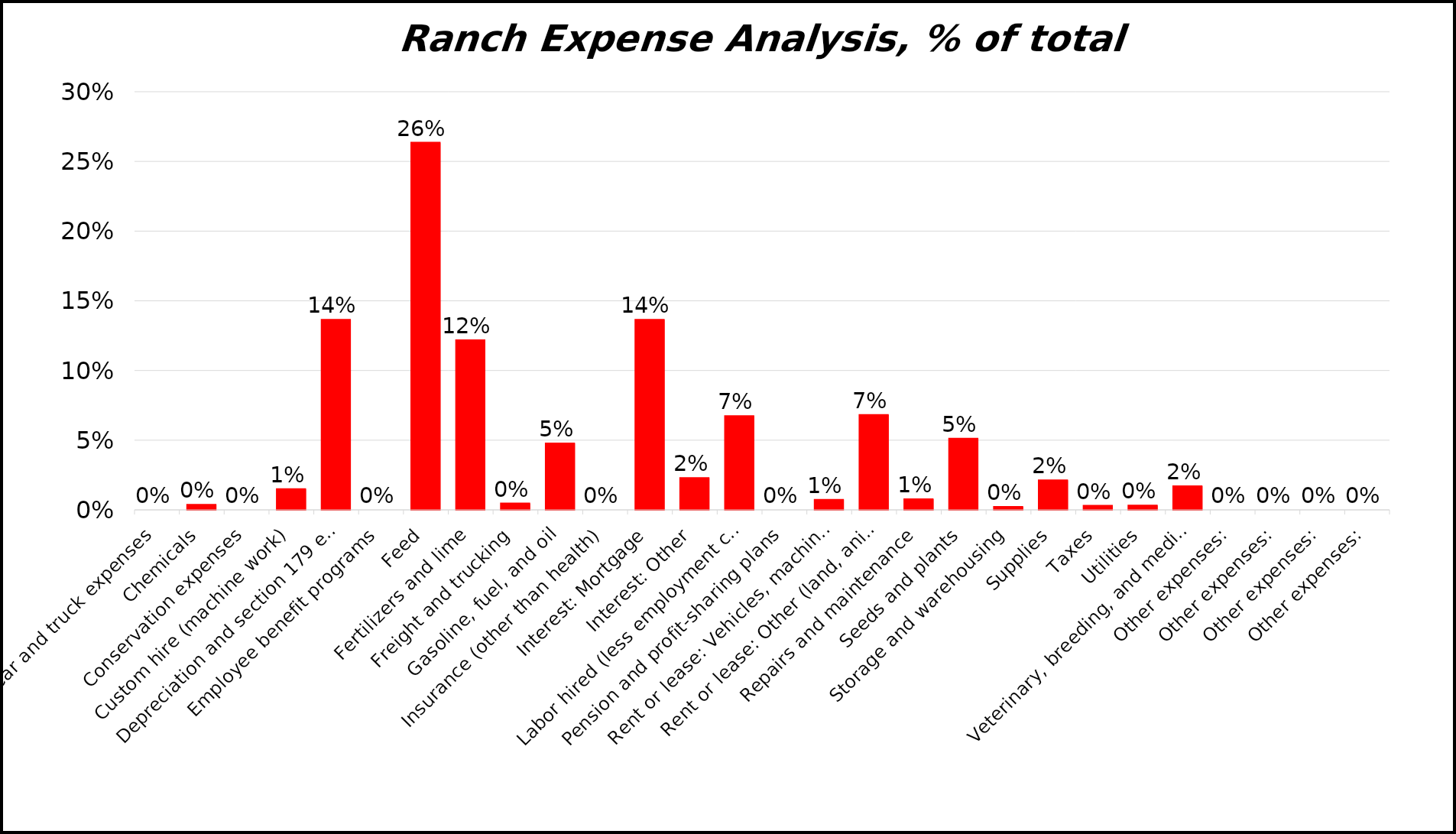
| Category | % of total costs |
|---|---|
| Car and truck expenses | 0 |
| Chemicals | 0.004 |
| Conservation expenses | 0 |
| Custom hire (machine work) | 0.015 |
| Depreciation and section 179 expense | 0.136 |
| Employee benefit programs | 0 |
| Feed | 0.264 |
| Fertilizers and lime | 0.122 |
| Freight and trucking | 0.005 |
| Gasoline, fuel, and oil | 0.048 |
| Insurance (other than health) | 0 |
| Interest: Mortgage | 0.136 |
| Interest: Other | 0.023 |
| Labor hired (less employment credits) | 0.067 |
| Pension and profit-sharing plans | 0 |
| Rent or lease: Vehicles, machinery, equipment | 0.007 |
| Rent or lease: Other (land, animals, etc.) | 0.068 |
| Repairs and maintenance | 0.008 |
| Seeds and plants | 0.051 |
| Storage and warehousing | 0.002 |
| Supplies | 0.021 |
| Taxes | 0.003 |
| Utilities | 0.003 |
| Veterinary, breeding, and medicine | 0.017 |
| Other expenses: | 0 |
| Other expenses: | 0 |
| Other expenses: | 0 |
| Other expenses: | 0 |